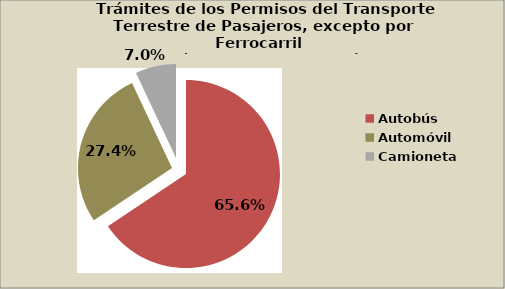
| Category | Series 0 |
|---|---|
| Autobús | 65.644 |
| Automóvil | 27.413 |
| Camioneta | 7 |